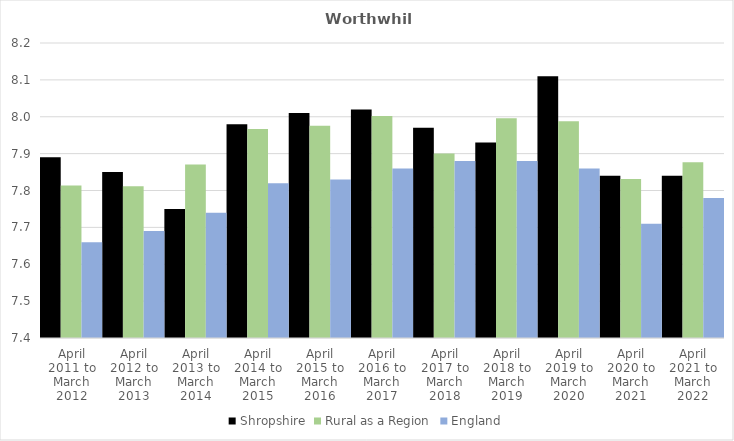
| Category | Shropshire | Rural as a Region | England |
|---|---|---|---|
| April 2011 to March 2012 | 7.89 | 7.813 | 7.66 |
| April 2012 to March 2013 | 7.85 | 7.811 | 7.69 |
| April 2013 to March 2014 | 7.75 | 7.871 | 7.74 |
| April 2014 to March 2015 | 7.98 | 7.967 | 7.82 |
| April 2015 to March 2016 | 8.01 | 7.975 | 7.83 |
| April 2016 to March 2017 | 8.02 | 8.002 | 7.86 |
| April 2017 to March 2018 | 7.97 | 7.9 | 7.88 |
| April 2018 to March 2019 | 7.93 | 7.996 | 7.88 |
| April 2019 to March 2020 | 8.11 | 7.988 | 7.86 |
| April 2020 to March 2021 | 7.84 | 7.831 | 7.71 |
| April 2021 to March 2022 | 7.84 | 7.877 | 7.78 |